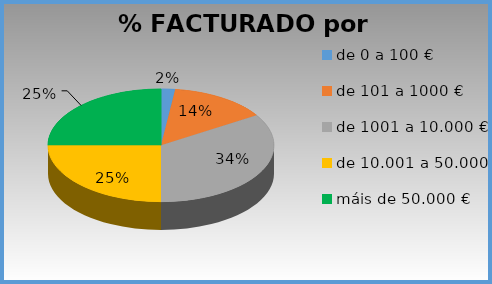
| Category | % Importe |
|---|---|
| de 0 a 100 € | 0.02 |
| de 101 a 1000 € | 0.14 |
| de 1001 a 10.000 € | 0.34 |
| de 10.001 a 50.000 € | 0.25 |
| máis de 50.000 € | 0.25 |